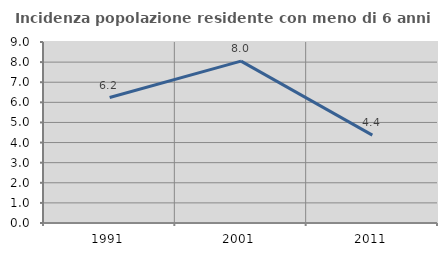
| Category | Incidenza popolazione residente con meno di 6 anni |
|---|---|
| 1991.0 | 6.237 |
| 2001.0 | 8.049 |
| 2011.0 | 4.37 |